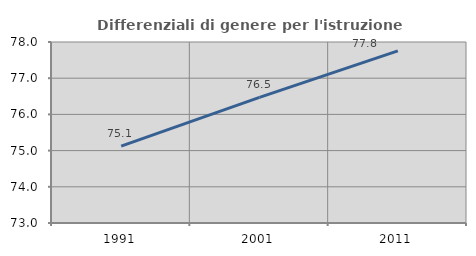
| Category | Differenziali di genere per l'istruzione superiore |
|---|---|
| 1991.0 | 75.123 |
| 2001.0 | 76.471 |
| 2011.0 | 77.754 |